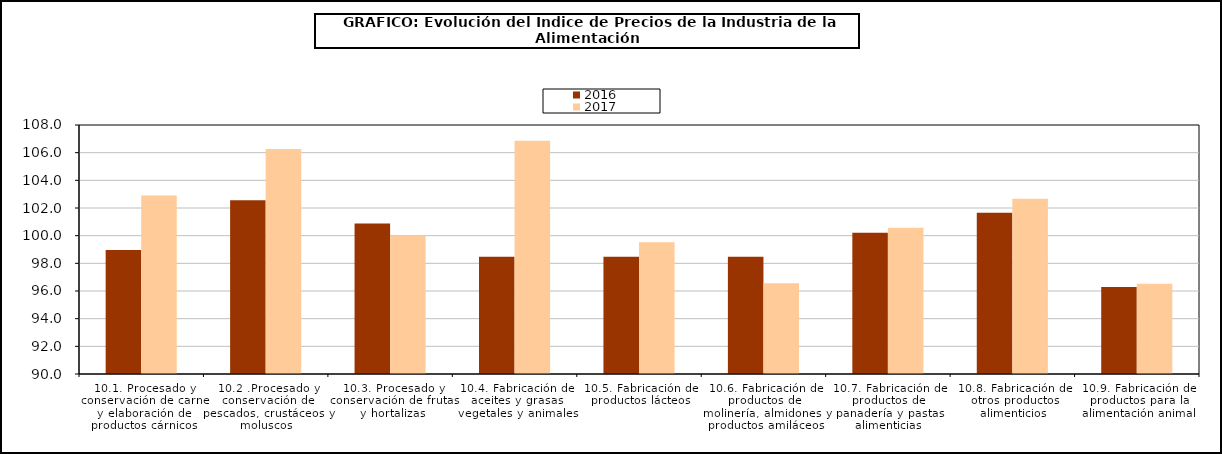
| Category | 2016 | 2017 |
|---|---|---|
| 10.1. Procesado y conservación de carne y elaboración de productos cárnicos | 98.956 | 102.909 |
| 10.2 .Procesado y conservación de pescados, crustáceos y moluscos | 102.562 | 106.26 |
| 10.3. Procesado y conservación de frutas y hortalizas | 100.873 | 100.011 |
| 10.4. Fabricación de aceites y grasas vegetales y animales | 98.47 | 106.86 |
| 10.5. Fabricación de productos lácteos | 98.469 | 99.52 |
| 10.6. Fabricación de productos de molinería, almidones y productos amiláceos | 98.475 | 96.559 |
| 10.7. Fabricación de productos de panadería y pastas alimenticias | 100.216 | 100.576 |
| 10.8. Fabricación de otros productos alimenticios | 101.656 | 102.664 |
| 10.9. Fabricación de productos para la alimentación animal | 96.282 | 96.517 |